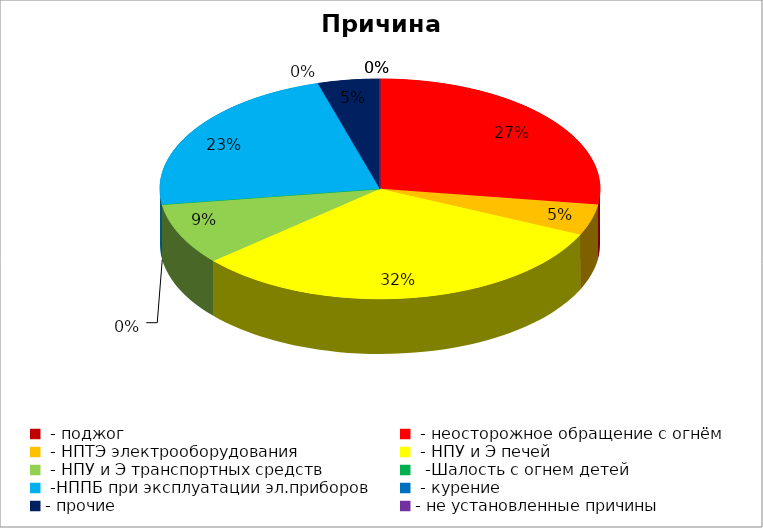
| Category | Причина пожара |
|---|---|
|  - поджог | 0 |
|  - неосторожное обращение с огнём | 6 |
|  - НПТЭ электрооборудования | 1 |
|  - НПУ и Э печей | 7 |
|  - НПУ и Э транспортных средств | 2 |
|   -Шалость с огнем детей | 0 |
|  -НППБ при эксплуатации эл.приборов | 5 |
|  - курение | 0 |
| - прочие | 1 |
| - не установленные причины | 0 |